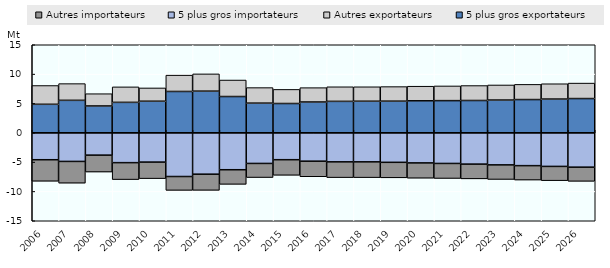
| Category | 5 plus gros exportateurs | Autres exportateurs | 5 plus gros importateurs | Autres importateurs |
|---|---|---|---|---|
| 2006.0 | 4.851 | 3.202 | -4.597 | -3.67 |
| 2007.0 | 5.529 | 2.848 | -4.887 | -3.707 |
| 2008.0 | 4.566 | 2.092 | -3.816 | -2.878 |
| 2009.0 | 5.182 | 2.639 | -5.097 | -2.886 |
| 2010.0 | 5.377 | 2.263 | -5.002 | -2.817 |
| 2011.0 | 7.038 | 2.782 | -7.459 | -2.363 |
| 2012.0 | 7.095 | 2.94 | -7.063 | -2.751 |
| 2013.0 | 6.174 | 2.813 | -6.304 | -2.488 |
| 2014.0 | 5.052 | 2.647 | -5.23 | -2.405 |
| 2015.0 | 4.984 | 2.406 | -4.592 | -2.655 |
| 2016.0 | 5.244 | 2.445 | -4.845 | -2.655 |
| 2017.0 | 5.353 | 2.483 | -4.964 | -2.684 |
| 2018.0 | 5.376 | 2.461 | -4.963 | -2.686 |
| 2019.0 | 5.388 | 2.482 | -5.04 | -2.64 |
| 2020.0 | 5.447 | 2.488 | -5.144 | -2.603 |
| 2021.0 | 5.474 | 2.507 | -5.233 | -2.559 |
| 2022.0 | 5.499 | 2.547 | -5.346 | -2.511 |
| 2023.0 | 5.576 | 2.571 | -5.481 | -2.478 |
| 2024.0 | 5.657 | 2.591 | -5.607 | -2.452 |
| 2025.0 | 5.743 | 2.612 | -5.735 | -2.432 |
| 2026.0 | 5.83 | 2.637 | -5.867 | -2.411 |